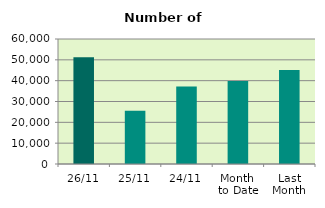
| Category | Series 0 |
|---|---|
| 26/11 | 51206 |
| 25/11 | 25554 |
| 24/11 | 37168 |
| Month 
to Date | 39852.3 |
| Last
Month | 45060.857 |